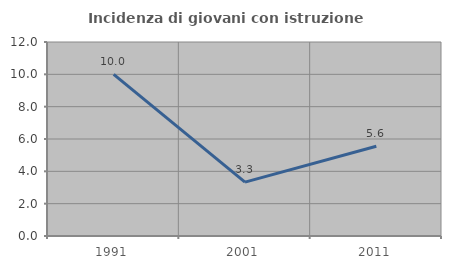
| Category | Incidenza di giovani con istruzione universitaria |
|---|---|
| 1991.0 | 10 |
| 2001.0 | 3.333 |
| 2011.0 | 5.556 |